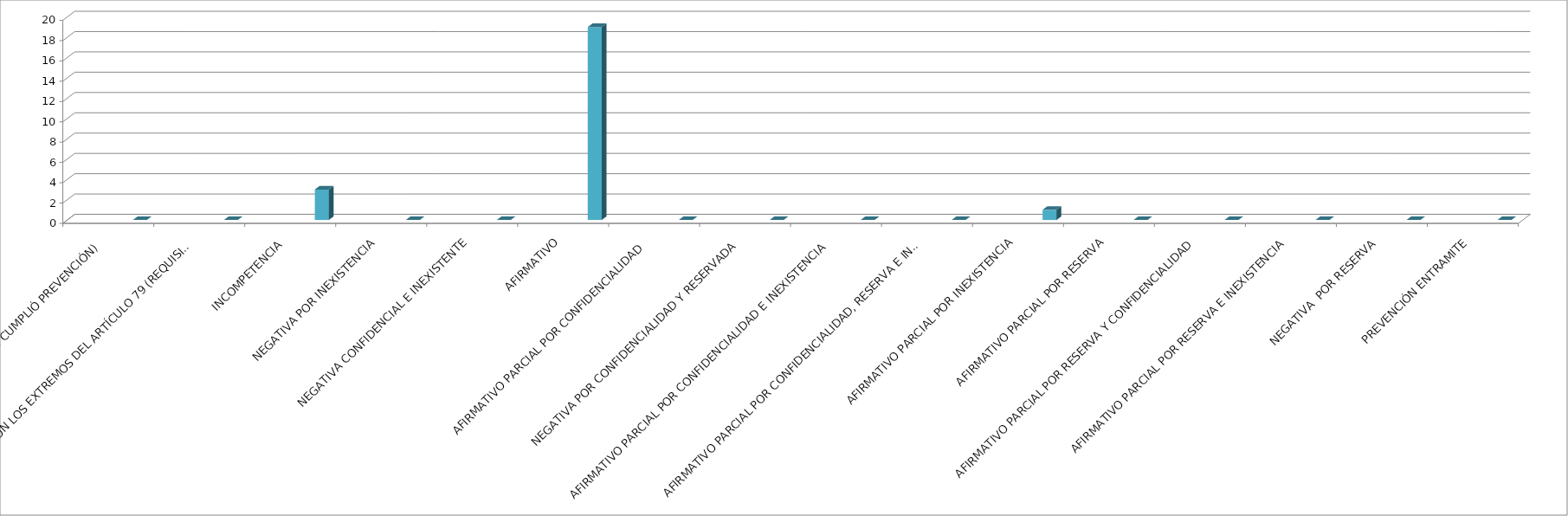
| Category | Series 0 | Series 1 | Series 2 | Series 3 | Series 4 |
|---|---|---|---|---|---|
| SE TIENE POR NO PRESENTADA ( NO CUMPLIÓ PREVENCIÓN) |  |  |  |  | 0 |
| NO CUMPLIO CON LOS EXTREMOS DEL ARTÍCULO 79 (REQUISITOS) |  |  |  |  | 0 |
| INCOMPETENCIA  |  |  |  |  | 3 |
| NEGATIVA POR INEXISTENCIA |  |  |  |  | 0 |
| NEGATIVA CONFIDENCIAL E INEXISTENTE |  |  |  |  | 0 |
| AFIRMATIVO |  |  |  |  | 19 |
| AFIRMATIVO PARCIAL POR CONFIDENCIALIDAD  |  |  |  |  | 0 |
| NEGATIVA POR CONFIDENCIALIDAD Y RESERVADA |  |  |  |  | 0 |
| AFIRMATIVO PARCIAL POR CONFIDENCIALIDAD E INEXISTENCIA |  |  |  |  | 0 |
| AFIRMATIVO PARCIAL POR CONFIDENCIALIDAD, RESERVA E INEXISTENCIA |  |  |  |  | 0 |
| AFIRMATIVO PARCIAL POR INEXISTENCIA |  |  |  |  | 1 |
| AFIRMATIVO PARCIAL POR RESERVA |  |  |  |  | 0 |
| AFIRMATIVO PARCIAL POR RESERVA Y CONFIDENCIALIDAD |  |  |  |  | 0 |
| AFIRMATIVO PARCIAL POR RESERVA E INEXISTENCIA |  |  |  |  | 0 |
| NEGATIVA  POR RESERVA |  |  |  |  | 0 |
| PREVENCIÓN ENTRAMITE |  |  |  |  | 0 |